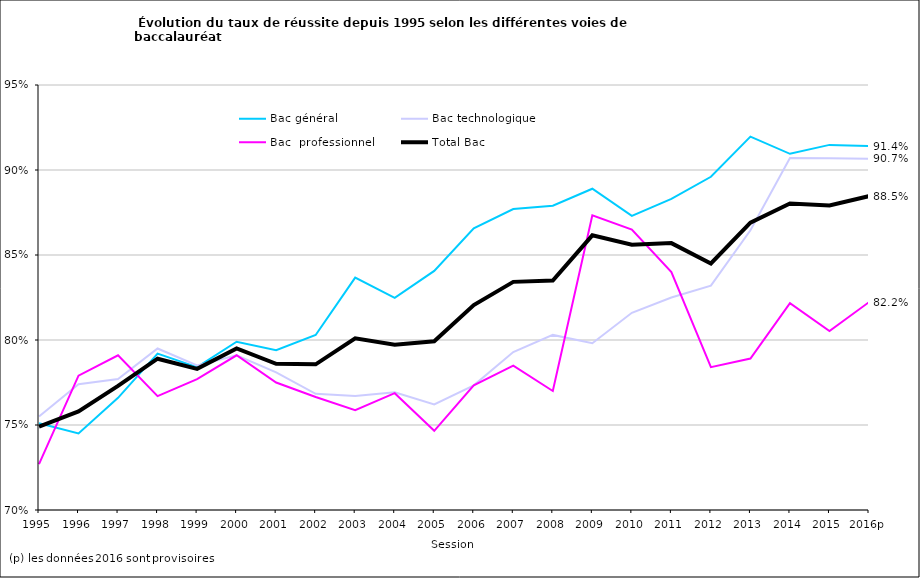
| Category | Bac général | Bac technologique | Bac  professionnel | Total Bac |
|---|---|---|---|---|
| 1995 | 0.751 | 0.755 | 0.727 | 0.749 |
| 1996 | 0.745 | 0.774 | 0.779 | 0.758 |
| 1997 | 0.766 | 0.777 | 0.791 | 0.773 |
| 1998 | 0.792 | 0.795 | 0.767 | 0.789 |
| 1999 | 0.784 | 0.785 | 0.777 | 0.783 |
| 2000 | 0.799 | 0.791 | 0.791 | 0.795 |
| 2001 | 0.794 | 0.781 | 0.775 | 0.786 |
| 2002 | 0.803 | 0.768 | 0.766 | 0.786 |
| 2003 | 0.837 | 0.767 | 0.759 | 0.801 |
| 2004 | 0.825 | 0.769 | 0.769 | 0.797 |
| 2005 | 0.841 | 0.762 | 0.747 | 0.799 |
| 2006 | 0.866 | 0.773 | 0.773 | 0.821 |
| 2007 | 0.877 | 0.793 | 0.785 | 0.834 |
| 2008 | 0.879 | 0.803 | 0.77 | 0.835 |
| 2009 | 0.889 | 0.798 | 0.873 | 0.862 |
| 2010 | 0.873 | 0.816 | 0.865 | 0.856 |
| 2011 | 0.883 | 0.825 | 0.84 | 0.857 |
| 2012 | 0.896 | 0.832 | 0.784 | 0.845 |
| 2013 | 0.92 | 0.865 | 0.789 | 0.869 |
| 2014 | 0.91 | 0.907 | 0.822 | 0.88 |
| 2015 | 0.915 | 0.907 | 0.805 | 0.879 |
| 2016p | 0.914 | 0.907 | 0.822 | 0.885 |